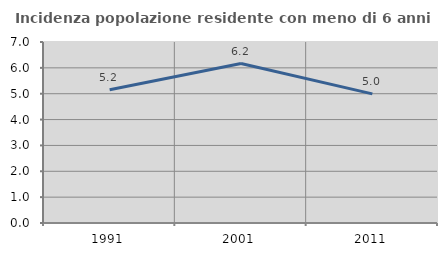
| Category | Incidenza popolazione residente con meno di 6 anni |
|---|---|
| 1991.0 | 5.151 |
| 2001.0 | 6.168 |
| 2011.0 | 4.993 |